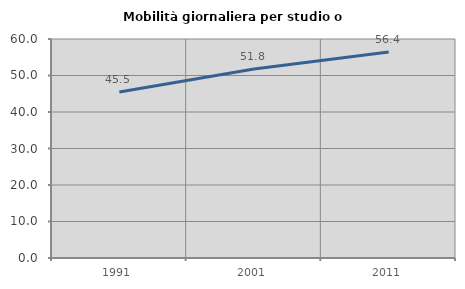
| Category | Mobilità giornaliera per studio o lavoro |
|---|---|
| 1991.0 | 45.492 |
| 2001.0 | 51.776 |
| 2011.0 | 56.431 |